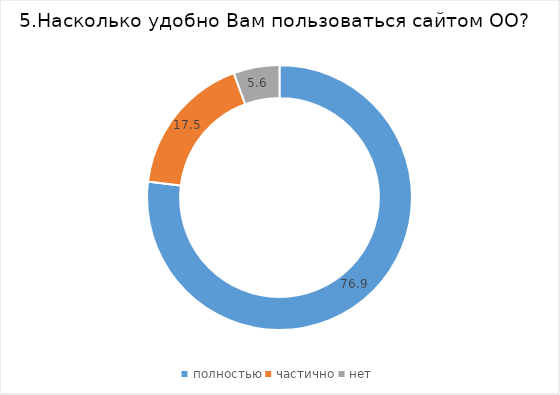
| Category | Series 0 |
|---|---|
| полностью | 76.913 |
| частично | 17.483 |
| нет | 5.604 |